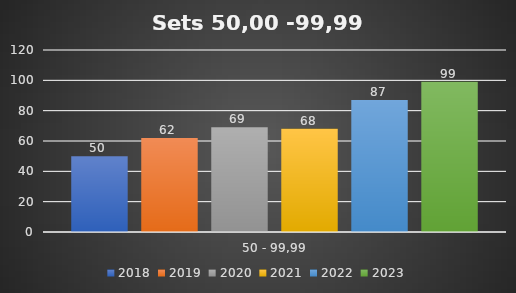
| Category | 2018 | 2019 | 2020 | 2021 | 2022 | 2023 |
|---|---|---|---|---|---|---|
| 50 - 99,99 | 50 | 62 | 69 | 68 | 87 | 99 |